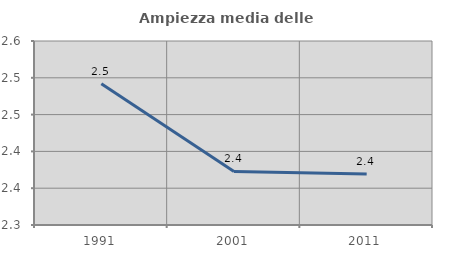
| Category | Ampiezza media delle famiglie |
|---|---|
| 1991.0 | 2.492 |
| 2001.0 | 2.373 |
| 2011.0 | 2.369 |